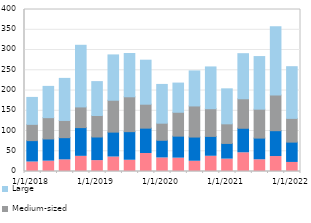
| Category | Micro | Small | Medium-sized | Large |
|---|---|---|---|---|
| 2018-01-01 | 23.458 | 52.774 | 40.183 | 66.517 |
| nan | 25.544 | 54.802 | 52.603 | 77.229 |
| nan | 28.673 | 54.873 | 42.484 | 103.899 |
| nan | 37.41 | 70.984 | 51.038 | 152.215 |
| 2019-01-01 | 26.913 | 58.293 | 53.033 | 83.702 |
| nan | 35.763 | 61.475 | 78.723 | 111.897 |
| nan | 27.759 | 70.634 | 86.103 | 106.825 |
| nan | 44.489 | 62.561 | 59.132 | 108.665 |
| 2020-01-01 | 33.497 | 43.549 | 42.255 | 95.672 |
| nan | 32.96 | 54.335 | 59 | 72.028 |
| nan | 25.293 | 59.78 | 76.792 | 86.501 |
| nan | 37.626 | 49.063 | 68.305 | 103.2 |
| 2021-01-01 | 30.617 | 38.71 | 48.392 | 86.375 |
| nan | 46.211 | 60.56 | 72.812 | 111.3 |
| nan | 28.92 | 53.554 | 71.432 | 129.875 |
| nan | 36.942 | 63.823 | 88.096 | 168.441 |
| 2022-01-01 | 22.354 | 50.182 | 58.632 | 127.609 |